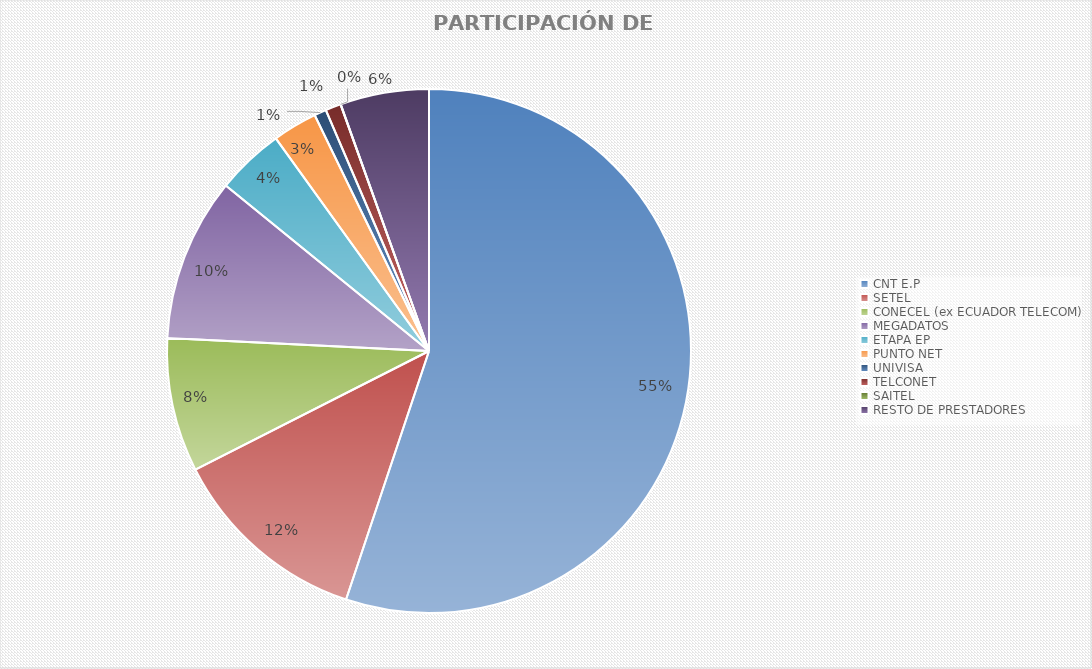
| Category | PARTICIPACIÓN DE MERCADO |
|---|---|
| CNT E.P | 0.551 |
| SETEL | 0.124 |
| CONECEL (ex ECUADOR TELECOM) | 0.083 |
| MEGADATOS | 0.101 |
| ETAPA EP | 0.042 |
| PUNTO NET | 0.028 |
| UNIVISA | 0.007 |
| TELCONET | 0.01 |
| SAITEL | 0 |
| RESTO DE PRESTADORES | 0.055 |